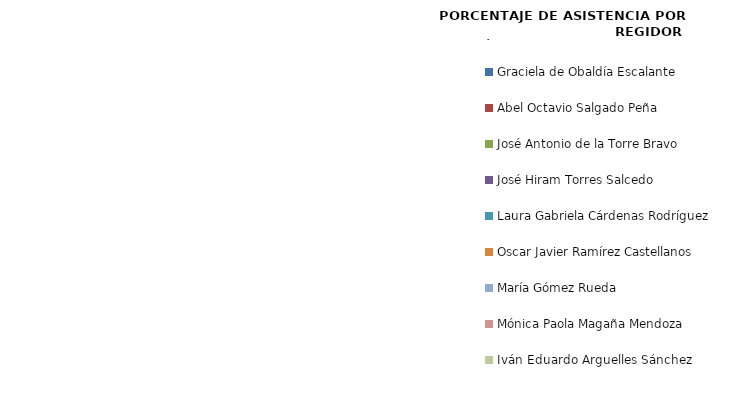
| Category | Series 0 |
|---|---|
| Graciela de Obaldía Escalante | 0 |
| Abel Octavio Salgado Peña | 0 |
| José Antonio de la Torre Bravo | 0 |
| José Hiram Torres Salcedo | 0 |
| Laura Gabriela Cárdenas Rodríguez | 0 |
| Oscar Javier Ramírez Castellanos | 0 |
| María Gómez Rueda | 0 |
| Mónica Paola Magaña Mendoza | 0 |
| Iván Eduardo Arguelles Sánchez | 0 |